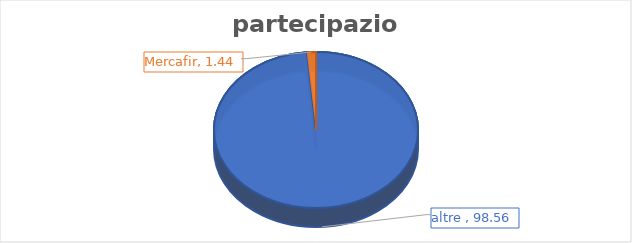
| Category | Series 0 |
|---|---|
| altre  | 98.56 |
| Mercafir | 1.44 |